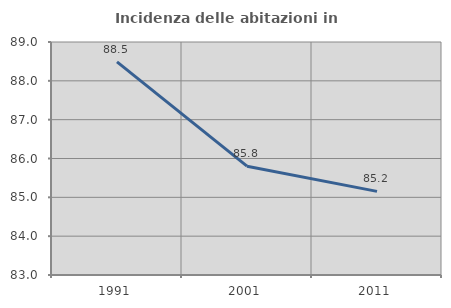
| Category | Incidenza delle abitazioni in proprietà  |
|---|---|
| 1991.0 | 88.489 |
| 2001.0 | 85.802 |
| 2011.0 | 85.154 |